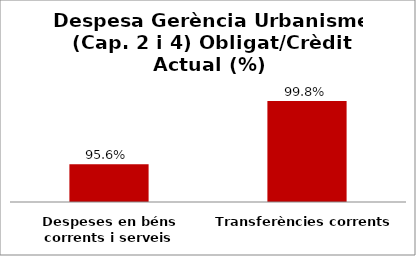
| Category | Series 0 |
|---|---|
| Despeses en béns corrents i serveis | 0.956 |
| Transferències corrents | 0.998 |